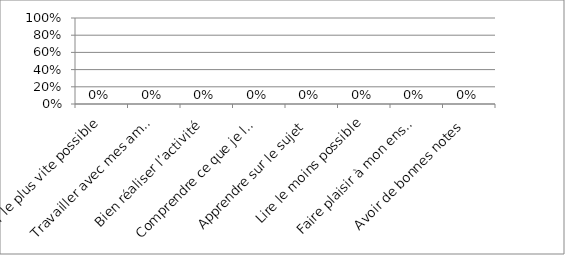
| Category | Series 0 |
|---|---|
| Finir le plus vite possible | 0 |
| Travailler avec mes amis | 0 |
| Bien réaliser l’activité | 0 |
| Comprendre ce que je lis | 0 |
| Apprendre sur le sujet | 0 |
| Lire le moins possible | 0 |
| Faire plaisir à mon enseignant ou à mon parent ou les impressionner | 0 |
| Avoir de bonnes notes | 0 |